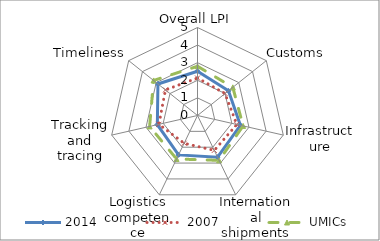
| Category | 2014 | 2007 | UMICs |
|---|---|---|---|
| Overall LPI | 2.515 | 2.13 | 2.799 |
| Customs | 2.25 | 2 | 2.567 |
| Infrastructure | 2.5 | 2.29 | 2.657 |
| International shipments | 2.625 | 2.2 | 2.829 |
| Logistics competence | 2.483 | 1.75 | 2.742 |
| Tracking and tracing | 2.34 | 2.25 | 2.791 |
| Timeliness | 2.875 | 2.33 | 3.193 |